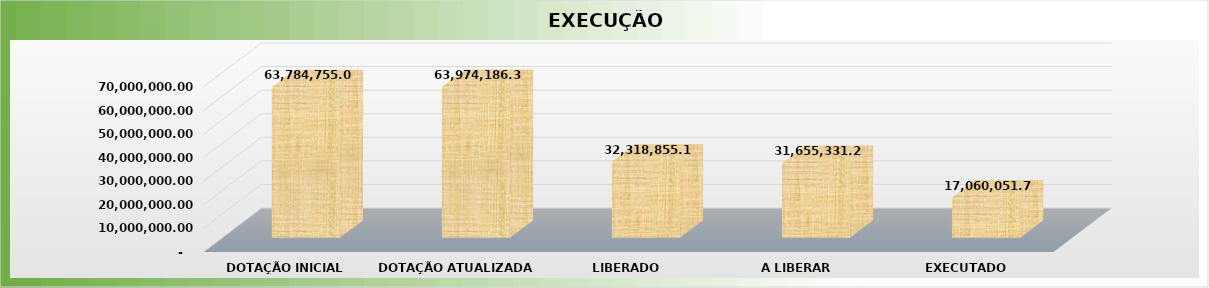
| Category | Series 0 |
|---|---|
| 0 | 63784755 |
| 1 | 63974186.35 |
| 2 | 32318855.14 |
| 3 | 31655331.21 |
| 4 | 17060051.72 |